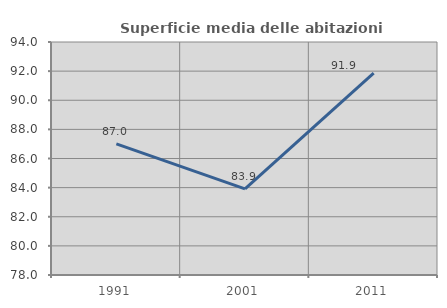
| Category | Superficie media delle abitazioni occupate |
|---|---|
| 1991.0 | 87.009 |
| 2001.0 | 83.916 |
| 2011.0 | 91.859 |